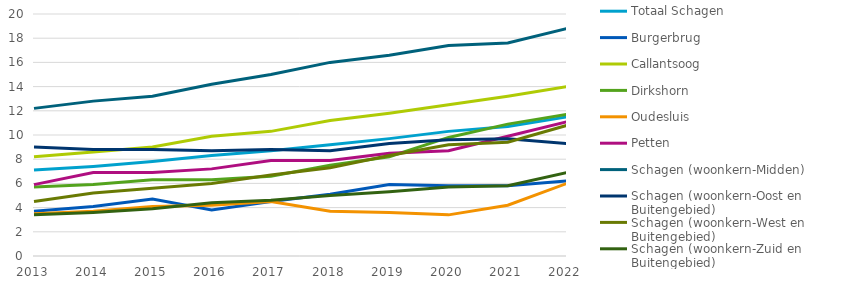
| Category | Totaal Schagen | Burgerbrug | Callantsoog | Dirkshorn | Oudesluis | Petten | Schagen (woonkern-Midden) | Schagen (woonkern-Oost en Buitengebied) | Schagen (woonkern-West en Buitengebied) | Schagen (woonkern-Zuid en Buitengebied) |
|---|---|---|---|---|---|---|---|---|---|---|
| 2013.0 | 7.1 | 3.7 | 8.2 | 5.7 | 3.5 | 5.9 | 12.2 | 9 | 4.5 | 3.4 |
| 2014.0 | 7.4 | 4.1 | 8.6 | 5.9 | 3.7 | 6.9 | 12.8 | 8.8 | 5.2 | 3.6 |
| 2015.0 | 7.8 | 4.7 | 9 | 6.3 | 4.1 | 6.9 | 13.2 | 8.8 | 5.6 | 3.9 |
| 2016.0 | 8.3 | 3.8 | 9.9 | 6.3 | 4.2 | 7.2 | 14.2 | 8.7 | 6 | 4.4 |
| 2017.0 | 8.7 | 4.5 | 10.3 | 6.6 | 4.5 | 7.9 | 15 | 8.8 | 6.7 | 4.6 |
| 2018.0 | 9.2 | 5.1 | 11.2 | 7.5 | 3.7 | 7.9 | 16 | 8.7 | 7.3 | 5 |
| 2019.0 | 9.7 | 5.9 | 11.8 | 8.2 | 3.6 | 8.5 | 16.6 | 9.3 | 8.3 | 5.3 |
| 2020.0 | 10.3 | 5.8 | 12.5 | 9.8 | 3.4 | 8.7 | 17.4 | 9.6 | 9.2 | 5.7 |
| 2021.0 | 10.7 | 5.8 | 13.2 | 10.9 | 4.2 | 9.9 | 17.6 | 9.7 | 9.4 | 5.8 |
| 2022.0 | 11.5 | 6.2 | 14 | 11.7 | 6 | 11.1 | 18.8 | 9.3 | 10.8 | 6.9 |